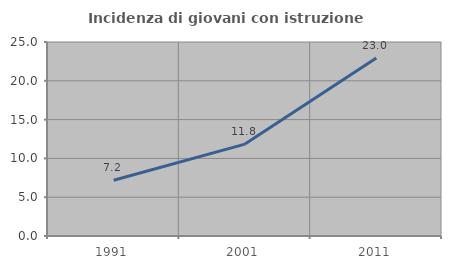
| Category | Incidenza di giovani con istruzione universitaria |
|---|---|
| 1991.0 | 7.19 |
| 2001.0 | 11.842 |
| 2011.0 | 22.951 |